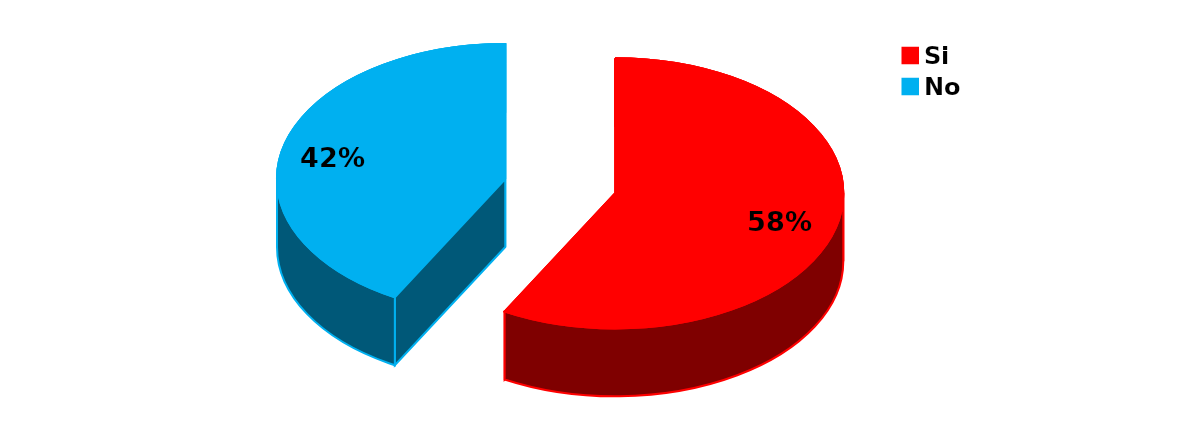
| Category | Series 0 |
|---|---|
| Si | 65 |
| No | 47 |